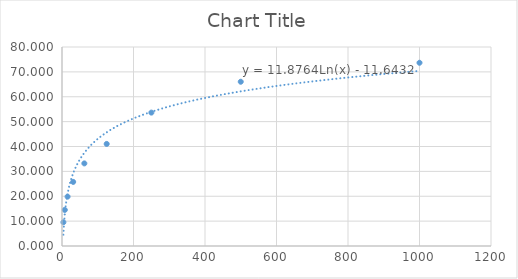
| Category | Series 0 |
|---|---|
| 3.91 | 9.542 |
| 7.81 | 14.504 |
| 15.62 | 19.847 |
| 31.25 | 25.763 |
| 62.5 | 33.206 |
| 125.0 | 41.031 |
| 250.0 | 53.626 |
| 500.0 | 66.031 |
| 1000.0 | 73.664 |